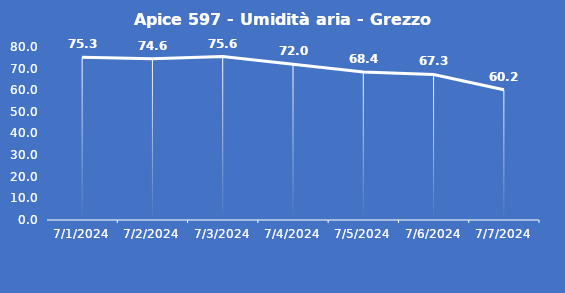
| Category | Apice 597 - Umidità aria - Grezzo (%) |
|---|---|
| 7/1/24 | 75.3 |
| 7/2/24 | 74.6 |
| 7/3/24 | 75.6 |
| 7/4/24 | 72 |
| 7/5/24 | 68.4 |
| 7/6/24 | 67.3 |
| 7/7/24 | 60.2 |